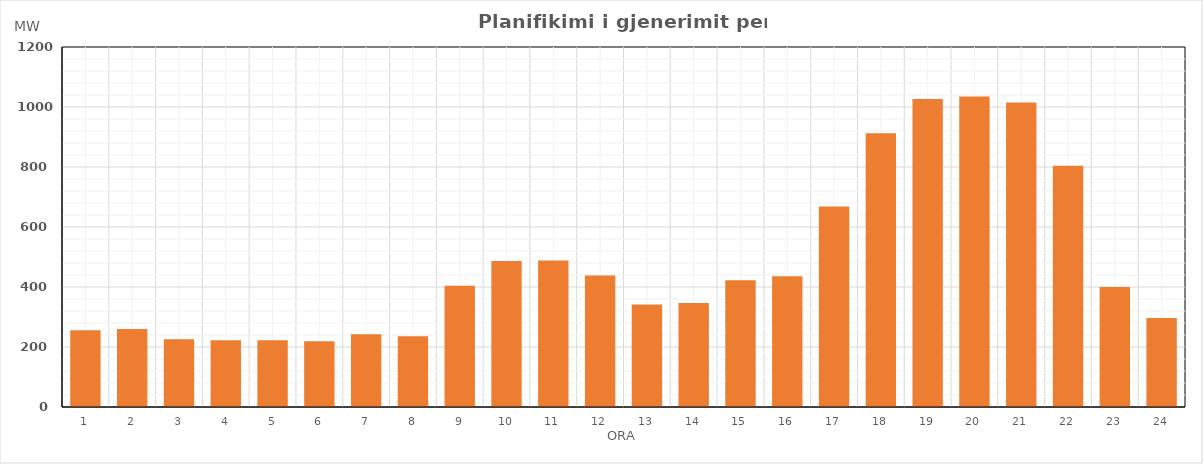
| Category | Max (MW) |
|---|---|
| 0 | 256.238 |
| 1 | 260.12 |
| 2 | 226.208 |
| 3 | 222.902 |
| 4 | 222.529 |
| 5 | 219.229 |
| 6 | 242.632 |
| 7 | 236.045 |
| 8 | 404.042 |
| 9 | 486.705 |
| 10 | 488.368 |
| 11 | 438.221 |
| 12 | 341.709 |
| 13 | 346.672 |
| 14 | 422.644 |
| 15 | 436.179 |
| 16 | 668.329 |
| 17 | 912.156 |
| 18 | 1026.41 |
| 19 | 1034.88 |
| 20 | 1015.037 |
| 21 | 804.473 |
| 22 | 399.588 |
| 23 | 297.033 |